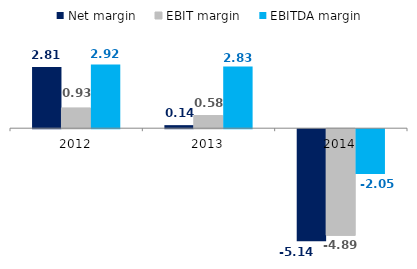
| Category | Net margin | EBIT margin | EBITDA margin |
|---|---|---|---|
| 2012.0 | 2.81 | 0.93 | 2.92 |
| 2013.0 | 0.14 | 0.58 | 2.83 |
| 2014.0 | -5.14 | -4.89 | -2.05 |